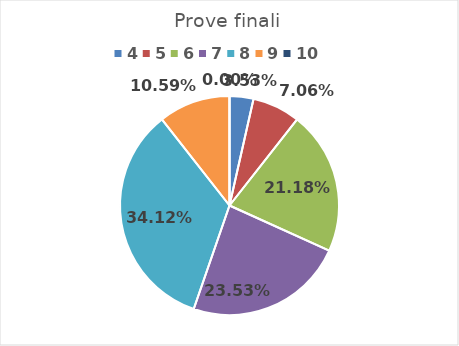
| Category | Series 0 |
|---|---|
| 4.0 | 0.035 |
| 5.0 | 0.071 |
| 6.0 | 0.212 |
| 7.0 | 0.235 |
| 8.0 | 0.341 |
| 9.0 | 0.106 |
| 10.0 | 0 |